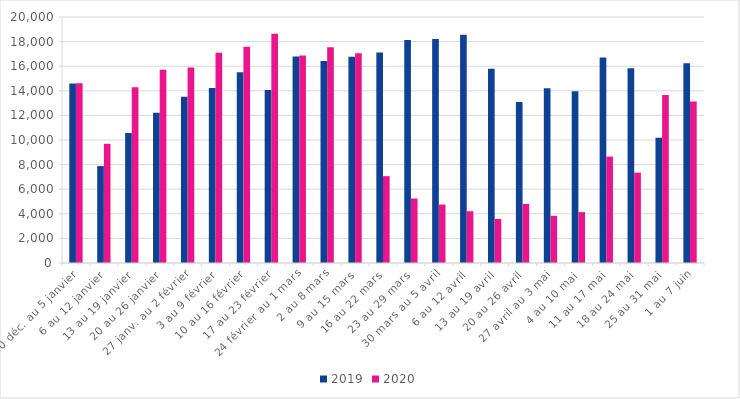
| Category | 2019 | 2020 |
|---|---|---|
| 30 déc. au 5 janvier | 14597 | 14615 |
| 6 au 12 janvier | 7879 | 9691 |
| 13 au 19 janvier | 10570 | 14288 |
| 20 au 26 janvier | 12222 | 15706 |
| 27 janv. au 2 février | 13510 | 15892 |
| 3 au 9 février | 14232 | 17087 |
| 10 au 16 février | 15499 | 17587 |
| 17 au 23 février | 14063 | 18630 |
| 24 février au 1 mars | 16783 | 16870 |
| 2 au 8 mars | 16432 | 17540.5 |
| 9 au 15 mars | 16765 | 17062.5 |
| 16 au 22 mars | 17107 | 7060 |
| 23 au 29 mars | 18126 | 5241 |
| 30 mars au 5 avril | 18204 | 4756 |
| 6 au 12 avril | 18560 | 4210 |
| 13 au 19 avril | 15788 | 3576 |
| 20 au 26 avril | 13099 | 4800 |
| 27 avril au 3 mai | 14207 | 3836 |
| 4 au 10 mai | 13969 | 4136 |
| 11 au 17 mai | 16713 | 8651 |
| 18 au 24 mai | 15841 | 7346 |
| 25 au 31 mai | 10184 | 13657 |
| 1 au 7 juin | 16246 | 13134 |